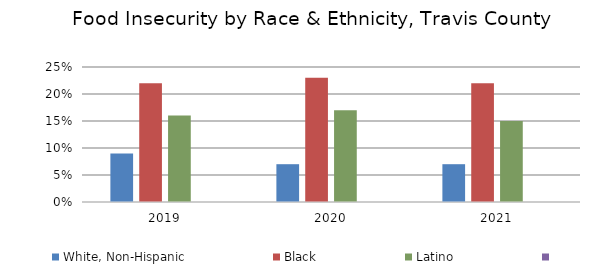
| Category | White, Non-Hispanic | Black | Latino | Series 3 |
|---|---|---|---|---|
| 2019.0 | 0.09 | 0.22 | 0.16 |  |
| 2020.0 | 0.07 | 0.23 | 0.17 |  |
| 2021.0 | 0.07 | 0.22 | 0.15 |  |